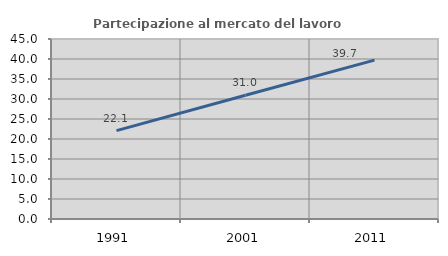
| Category | Partecipazione al mercato del lavoro  femminile |
|---|---|
| 1991.0 | 22.093 |
| 2001.0 | 30.952 |
| 2011.0 | 39.726 |